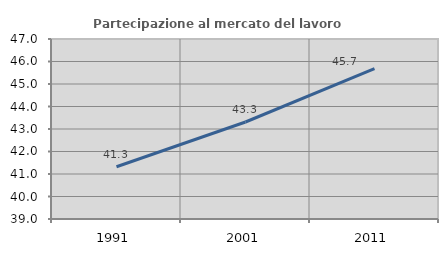
| Category | Partecipazione al mercato del lavoro  femminile |
|---|---|
| 1991.0 | 41.323 |
| 2001.0 | 43.311 |
| 2011.0 | 45.685 |